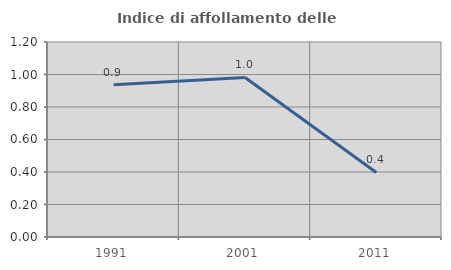
| Category | Indice di affollamento delle abitazioni  |
|---|---|
| 1991.0 | 0.938 |
| 2001.0 | 0.982 |
| 2011.0 | 0.397 |